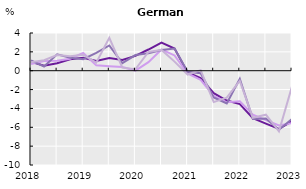
| Category | Basic wage (all sectors) | Basic wage (private sector) | Wage incl. Lump sums and special payments (all sectors) | Wage incl. Lump sums and special payments (private sector) |
|---|---|---|---|---|
| 2018.0 | 0.956 | 0.717 | 1.1 | 0.886 |
| nan | 0.523 | 1.02 | 0.444 | 1.104 |
| nan | 0.789 | 1.068 | 1.732 | 1.656 |
| nan | 1.209 | 1.27 | 1.366 | 1.525 |
| 2019.0 | 1.383 | 1.877 | 1.218 | 1.692 |
| nan | 1.021 | 0.568 | 1.9 | 0.853 |
| nan | 1.341 | 0.485 | 2.674 | 3.488 |
| nan | 1.132 | 0.39 | 0.799 | 0.322 |
| 2020.0 | 1.567 | 0.014 | 1.661 | 0.15 |
| nan | 2.248 | 0.903 | 1.851 | 1.987 |
| nan | 2.98 | 2.252 | 2.204 | 2.208 |
| nan | 2.344 | 1.622 | 2.346 | 0.964 |
| 2021.0 | -0.191 | -0.289 | -0.11 | -0.405 |
| nan | -0.774 | -0.968 | -0.267 | 0.061 |
| nan | -2.388 | -2.677 | -2.83 | -3.331 |
| nan | -3.165 | -3.355 | -3.468 | -2.854 |
| 2022.0 | -3.532 | -3.246 | -0.856 | -1.08 |
| nan | -5.04 | -4.666 | -5.128 | -4.985 |
| nan | -5.609 | -5.238 | -5.065 | -4.662 |
| nan | -6.182 | -5.816 | -6.265 | -6.426 |
| 2023.0 | -5.346 | -5.559 | -5.114 | -1.662 |